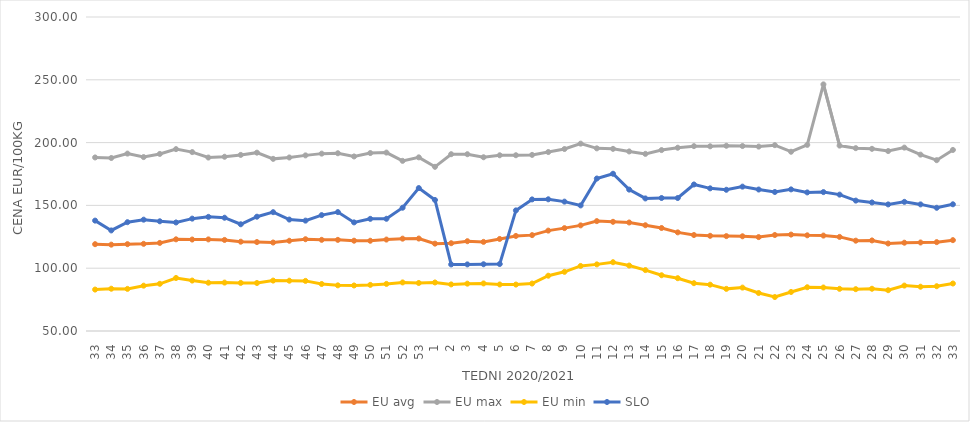
| Category | EU avg | EU max | EU min | SLO |
|---|---|---|---|---|
| 33.0 | 119.127 | 188.18 | 82.99 | 137.89 |
| 34.0 | 118.75 | 187.74 | 83.66 | 130.07 |
| 35.0 | 119.136 | 191.25 | 83.53 | 136.63 |
| 36.0 | 119.398 | 188.47 | 86.09 | 138.64 |
| 37.0 | 120.135 | 190.99 | 87.57 | 137.35 |
| 38.0 | 122.982 | 194.8 | 92.21 | 136.42 |
| 39.0 | 122.832 | 192.45 | 90.16 | 139.46 |
| 40.0 | 122.936 | 188.11 | 88.45 | 140.87 |
| 41.0 | 122.507 | 188.73 | 88.54 | 140.18 |
| 42.0 | 121.098 | 190.2 | 88.3 | 134.98 |
| 43.0 | 120.822 | 191.99 | 88.22 | 141 |
| 44.0 | 120.448 | 187.06 | 90.13 | 144.61 |
| 45.0 | 121.843 | 188.15 | 90.04 | 138.73 |
| 46.0 | 123.07 | 189.82 | 89.89 | 137.88 |
| 47.0 | 122.58 | 191.22 | 87.43 | 142.27 |
| 48.0 | 122.553 | 191.52 | 86.35 | 144.69 |
| 49.0 | 121.893 | 188.97 | 86.24 | 136.47 |
| 50.0 | 121.851 | 191.67 | 86.72 | 139.29 |
| 51.0 | 122.8 | 192.06 | 87.5 | 139.35 |
| 52.0 | 123.52 | 185.468 | 88.67 | 148.16 |
| 53.0 | 123.611 | 188.25 | 88.23 | 163.81 |
| 1.0 | 119.553 | 180.72 | 88.64 | 154.31 |
| 2.0 | 119.893 | 190.77 | 87.1 | 103.02 |
| 3.0 | 121.489 | 190.76 | 87.7 | 103.03 |
| 4.0 | 120.954 | 188.33 | 87.88 | 103.15 |
| 5.0 | 123.293 | 189.91 | 87.04 | 103.34 |
| 6.0 | 125.679 | 189.94 | 86.97 | 146.03 |
| 7.0 | 126.33 | 190.21 | 87.79 | 154.77 |
| 8.0 | 129.933 | 192.48 | 94.02 | 154.86 |
| 9.0 | 131.908 | 194.884 | 97.12 | 153 |
| 10.0 | 134.098 | 199.17 | 101.79 | 149.98 |
| 11.0 | 137.49 | 195.419 | 103.05 | 171.4 |
| 12.0 | 136.929 | 195.013 | 104.76 | 175.2 |
| 13.0 | 136.39 | 192.952 | 102.11 | 162.57 |
| 14.0 | 134.198 | 191.034 | 98.5 | 155.55 |
| 15.0 | 132.003 | 194.047 | 94.39 | 155.88 |
| 16.0 | 128.53 | 195.913 | 92.04 | 155.88 |
| 17.0 | 126.415 | 197.188 | 88.07 | 166.66 |
| 18.0 | 125.787 | 197.055 | 86.89 | 163.58 |
| 19.0 | 125.54 | 197.478 | 83.546 | 162.44 |
| 20.0 | 125.412 | 197.263 | 84.55 | 164.94 |
| 21.0 | 124.768 | 196.821 | 80.264 | 162.64 |
| 22.0 | 126.43 | 197.963 | 77.048 | 160.68 |
| 23.0 | 126.76 | 192.72 | 81.087 | 162.75 |
| 24.0 | 126.19 | 198.186 | 84.83 | 160.34 |
| 25.0 | 125.97 | 246.36 | 84.63 | 160.6 |
| 26.0 | 124.92 | 197.607 | 83.57 | 158.57 |
| 27.0 | 121.922 | 195.566 | 83.3 | 153.83 |
| 28.0 | 122.106 | 195.043 | 83.64 | 152.35 |
| 29.0 | 119.659 | 193.272 | 82.49 | 150.79 |
| 30.0 | 120.3 | 196.01 | 86.16 | 152.82 |
| 31.0 | 120.473 | 190.42 | 85.26 | 150.8 |
| 32.0 | 120.756 | 186 | 85.65 | 148.1 |
| 33.0 | 122.337 | 194.145 | 87.8 | 150.88 |